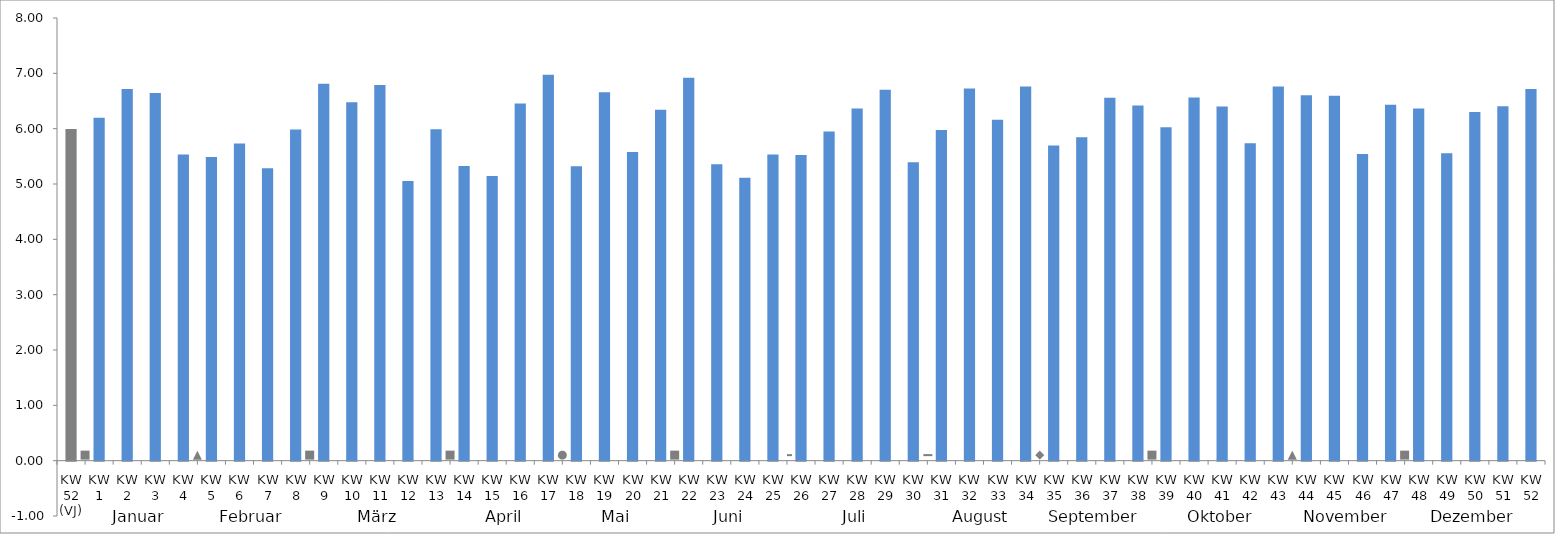
| Category | Series 0 |
|---|---|
| KW 52 (VJ) | 5.992 |
| KW 1 | 6.197 |
| KW 2 | 6.717 |
| KW 3 | 6.644 |
| KW 4 | 5.532 |
| KW 5 | 5.49 |
| KW 6 | 5.731 |
| KW 7 | 5.283 |
| KW 8 | 5.985 |
| KW 9 | 6.812 |
| KW 10 | 6.479 |
| KW 11 | 6.791 |
| KW 12 | 5.056 |
| KW 13 | 5.991 |
| KW 14 | 5.324 |
| KW 15 | 5.145 |
| KW 16 | 6.455 |
| KW 17 | 6.973 |
| KW 18 | 5.321 |
| KW 19 | 6.659 |
| KW 20 | 5.576 |
| KW 21 | 6.344 |
| KW 22 | 6.922 |
| KW 23 | 5.358 |
| KW 24 | 5.112 |
| KW 25 | 5.532 |
| KW 26 | 5.523 |
| KW 27 | 5.95 |
| KW 28 | 6.364 |
| KW 29 | 6.701 |
| KW 30 | 5.395 |
| KW 31 | 5.977 |
| KW 32 | 6.728 |
| KW 33 | 6.161 |
| KW 34 | 6.762 |
| KW 35 | 5.695 |
| KW 36 | 5.845 |
| KW 37 | 6.559 |
| KW 38 | 6.42 |
| KW 39 | 6.028 |
| KW 40 | 6.563 |
| KW 41 | 6.4 |
| KW 42 | 5.738 |
| KW 43 | 6.76 |
| KW 44 | 6.605 |
| KW 45 | 6.593 |
| KW 46 | 5.541 |
| KW 47 | 6.434 |
| KW 48 | 6.366 |
| KW 49 | 5.556 |
| KW 50 | 6.301 |
| KW 51 | 6.404 |
| KW 52 | 6.717 |